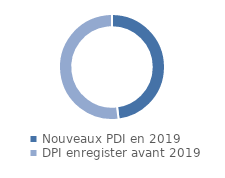
| Category | Series 0 |
|---|---|
| Nouveaux PDI en 2019 | 0.48 |
| DPI enregister avant 2019 | 0.52 |